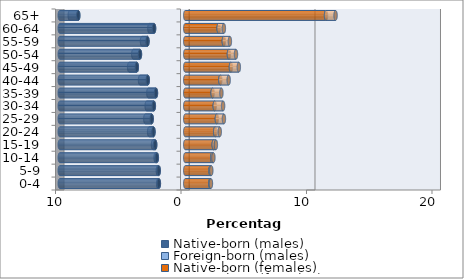
| Category | Native-born (males) | Foreign-born (males) | Native-born (females) | Foreign-born (females) |
|---|---|---|---|---|
| 0-4 | -2.102 | -0.059 | 1.993 | 0.053 |
| 5-9 | -2.115 | -0.07 | 2.009 | 0.067 |
| 10-14 | -2.263 | -0.098 | 2.146 | 0.097 |
| 15-19 | -2.396 | -0.172 | 2.267 | 0.174 |
| 20-24 | -2.531 | -0.348 | 2.383 | 0.366 |
| 25-29 | -2.674 | -0.508 | 2.518 | 0.563 |
| 30-34 | -2.501 | -0.572 | 2.35 | 0.666 |
| 35-39 | -2.335 | -0.606 | 2.181 | 0.7 |
| 40-44 | -2.986 | -0.618 | 2.794 | 0.666 |
| 45-49 | -3.858 | -0.615 | 3.639 | 0.632 |
| 50-54 | -3.61 | -0.531 | 3.48 | 0.563 |
| 55-59 | -3.01 | -0.438 | 3.072 | 0.485 |
| 60-64 | -2.485 | -0.375 | 2.659 | 0.418 |
| 65+ | -8.525 | -0.679 | 11.218 | 0.761 |